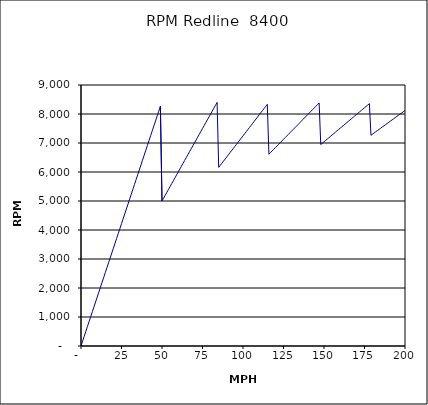
| Category | RPM Redline  8400 |
|---|---|
| 0.0 | 0 |
| 1.0 | 168.698 |
| 2.0 | 337.396 |
| 3.0 | 506.094 |
| 4.0 | 674.792 |
| 5.0 | 843.491 |
| 6.0 | 1012.189 |
| 7.0 | 1180.887 |
| 8.0 | 1349.585 |
| 9.0 | 1518.283 |
| 10.0 | 1686.981 |
| 11.0 | 1855.679 |
| 12.0 | 2024.377 |
| 13.0 | 2193.076 |
| 14.0 | 2361.774 |
| 15.0 | 2530.472 |
| 16.0 | 2699.17 |
| 17.0 | 2867.868 |
| 18.0 | 3036.566 |
| 19.0 | 3205.264 |
| 20.0 | 3373.962 |
| 21.0 | 3542.66 |
| 22.0 | 3711.359 |
| 23.0 | 3880.057 |
| 24.0 | 4048.755 |
| 25.0 | 4217.453 |
| 26.0 | 4386.151 |
| 27.0 | 4554.849 |
| 28.0 | 4723.547 |
| 29.0 | 4892.245 |
| 30.0 | 5060.944 |
| 31.0 | 5229.642 |
| 32.0 | 5398.34 |
| 33.0 | 5567.038 |
| 34.0 | 5735.736 |
| 35.0 | 5904.434 |
| 36.0 | 6073.132 |
| 37.0 | 6241.83 |
| 38.0 | 6410.528 |
| 39.0 | 6579.227 |
| 40.0 | 6747.925 |
| 41.0 | 6916.623 |
| 42.0 | 7085.321 |
| 43.0 | 7254.019 |
| 44.0 | 7422.717 |
| 45.0 | 7591.415 |
| 46.0 | 7760.113 |
| 47.0 | 7928.812 |
| 48.0 | 8097.51 |
| 49.0 | 8266.208 |
| 50.0 | 4999.637 |
| 51.0 | 5099.63 |
| 52.0 | 5199.623 |
| 53.0 | 5299.615 |
| 54.0 | 5399.608 |
| 55.0 | 5499.601 |
| 56.0 | 5599.594 |
| 57.0 | 5699.586 |
| 58.0 | 5799.579 |
| 59.0 | 5899.572 |
| 60.0 | 5999.565 |
| 61.0 | 6099.557 |
| 62.0 | 6199.55 |
| 63.0 | 6299.543 |
| 64.0 | 6399.536 |
| 65.0 | 6499.528 |
| 66.0 | 6599.521 |
| 67.0 | 6699.514 |
| 68.0 | 6799.507 |
| 69.0 | 6899.499 |
| 70.0 | 6999.492 |
| 71.0 | 7099.485 |
| 72.0 | 7199.478 |
| 73.0 | 7299.47 |
| 74.0 | 7399.463 |
| 75.0 | 7499.456 |
| 76.0 | 7599.449 |
| 77.0 | 7699.441 |
| 78.0 | 7799.434 |
| 79.0 | 7899.427 |
| 80.0 | 7999.42 |
| 81.0 | 8099.412 |
| 82.0 | 8199.405 |
| 83.0 | 8299.398 |
| 84.0 | 8399.391 |
| 85.0 | 6159.088 |
| 86.0 | 6231.548 |
| 87.0 | 6304.008 |
| 88.0 | 6376.468 |
| 89.0 | 6448.927 |
| 90.0 | 6521.387 |
| 91.0 | 6593.847 |
| 92.0 | 6666.307 |
| 93.0 | 6738.767 |
| 94.0 | 6811.227 |
| 95.0 | 6883.687 |
| 96.0 | 6956.146 |
| 97.0 | 7028.606 |
| 98.0 | 7101.066 |
| 99.0 | 7173.526 |
| 100.0 | 7245.986 |
| 101.0 | 7318.446 |
| 102.0 | 7390.906 |
| 103.0 | 7463.365 |
| 104.0 | 7535.825 |
| 105.0 | 7608.285 |
| 106.0 | 7680.745 |
| 107.0 | 7753.205 |
| 108.0 | 7825.665 |
| 109.0 | 7898.125 |
| 110.0 | 7970.584 |
| 111.0 | 8043.044 |
| 112.0 | 8115.504 |
| 113.0 | 8187.964 |
| 114.0 | 8260.424 |
| 115.0 | 8332.884 |
| 116.0 | 6613.174 |
| 117.0 | 6670.184 |
| 118.0 | 6727.194 |
| 119.0 | 6784.204 |
| 120.0 | 6841.214 |
| 121.0 | 6898.224 |
| 122.0 | 6955.234 |
| 123.0 | 7012.244 |
| 124.0 | 7069.254 |
| 125.0 | 7126.265 |
| 126.0 | 7183.275 |
| 127.0 | 7240.285 |
| 128.0 | 7297.295 |
| 129.0 | 7354.305 |
| 130.0 | 7411.315 |
| 131.0 | 7468.325 |
| 132.0 | 7525.335 |
| 133.0 | 7582.346 |
| 134.0 | 7639.356 |
| 135.0 | 7696.366 |
| 136.0 | 7753.376 |
| 137.0 | 7810.386 |
| 138.0 | 7867.396 |
| 139.0 | 7924.406 |
| 140.0 | 7981.416 |
| 141.0 | 8038.426 |
| 142.0 | 8095.437 |
| 143.0 | 8152.447 |
| 144.0 | 8209.457 |
| 145.0 | 8266.467 |
| 146.0 | 8323.477 |
| 147.0 | 8380.487 |
| 148.0 | 6947.752 |
| 149.0 | 6994.696 |
| 150.0 | 7041.64 |
| 151.0 | 7088.584 |
| 152.0 | 7135.529 |
| 153.0 | 7182.473 |
| 154.0 | 7229.417 |
| 155.0 | 7276.362 |
| 156.0 | 7323.306 |
| 157.0 | 7370.25 |
| 158.0 | 7417.194 |
| 159.0 | 7464.139 |
| 160.0 | 7511.083 |
| 161.0 | 7558.027 |
| 162.0 | 7604.971 |
| 163.0 | 7651.916 |
| 164.0 | 7698.86 |
| 165.0 | 7745.804 |
| 166.0 | 7792.748 |
| 167.0 | 7839.693 |
| 168.0 | 7886.637 |
| 169.0 | 7933.581 |
| 170.0 | 7980.526 |
| 171.0 | 8027.47 |
| 172.0 | 8074.414 |
| 173.0 | 8121.358 |
| 174.0 | 8168.303 |
| 175.0 | 8215.247 |
| 176.0 | 8262.191 |
| 177.0 | 8309.135 |
| 178.0 | 8356.08 |
| 179.0 | 7267.48 |
| 180.0 | 7308.081 |
| 181.0 | 7348.681 |
| 182.0 | 7389.282 |
| 183.0 | 7429.882 |
| 184.0 | 7470.482 |
| 185.0 | 7511.083 |
| 186.0 | 7551.683 |
| 187.0 | 7592.284 |
| 188.0 | 7632.884 |
| 189.0 | 7673.485 |
| 190.0 | 7714.085 |
| 191.0 | 7754.686 |
| 192.0 | 7795.286 |
| 193.0 | 7835.886 |
| 194.0 | 7876.487 |
| 195.0 | 7917.087 |
| 196.0 | 7957.688 |
| 197.0 | 7998.288 |
| 198.0 | 8038.889 |
| 199.0 | 8079.489 |
| 200.0 | 8120.09 |